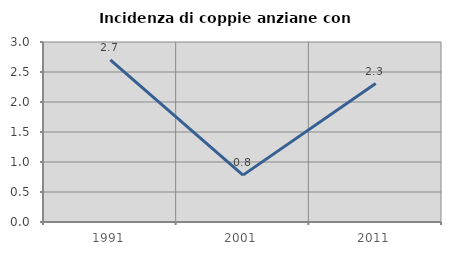
| Category | Incidenza di coppie anziane con figli |
|---|---|
| 1991.0 | 2.703 |
| 2001.0 | 0.781 |
| 2011.0 | 2.308 |